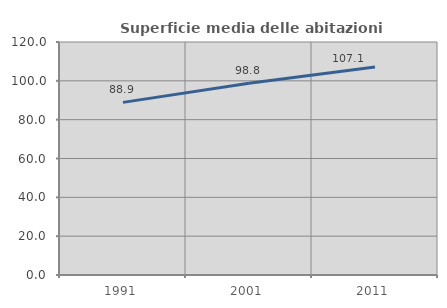
| Category | Superficie media delle abitazioni occupate |
|---|---|
| 1991.0 | 88.902 |
| 2001.0 | 98.751 |
| 2011.0 | 107.127 |